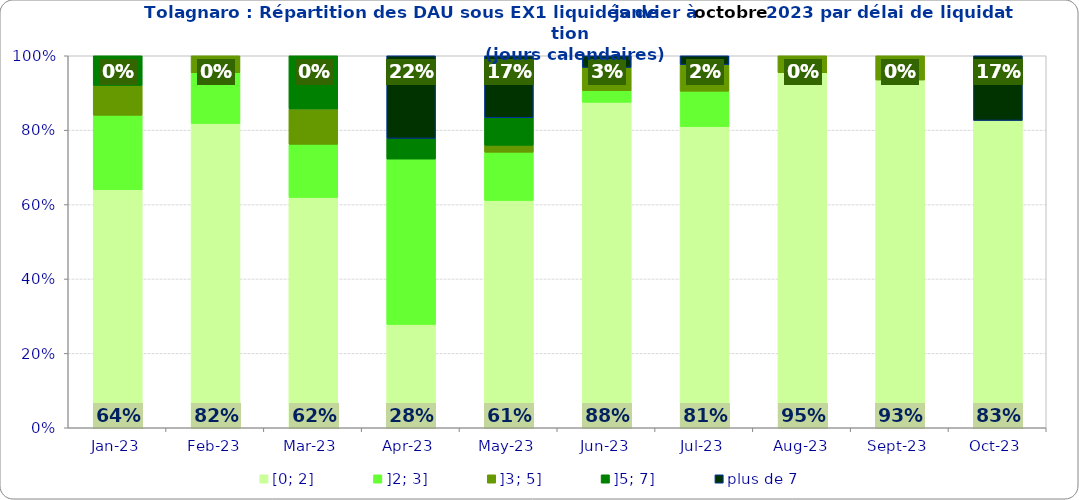
| Category | [0; 2] | ]2; 3] | ]3; 5] | ]5; 7] | plus de 7 |
|---|---|---|---|---|---|
| 2023-01-01 | 0.64 | 0.2 | 0.08 | 0.08 | 0 |
| 2023-02-01 | 0.818 | 0.136 | 0.045 | 0 | 0 |
| 2023-03-01 | 0.619 | 0.143 | 0.095 | 0.143 | 0 |
| 2023-04-01 | 0.278 | 0.444 | 0 | 0.056 | 0.222 |
| 2023-05-01 | 0.611 | 0.13 | 0.019 | 0.074 | 0.167 |
| 2023-06-01 | 0.875 | 0.031 | 0.062 | 0 | 0.031 |
| 2023-07-01 | 0.81 | 0.095 | 0.071 | 0 | 0.024 |
| 2023-08-01 | 0.955 | 0 | 0.045 | 0 | 0 |
| 2023-09-01 | 0.935 | 0 | 0.065 | 0 | 0 |
| 2023-10-01 | 0.826 | 0 | 0 | 0 | 0.174 |